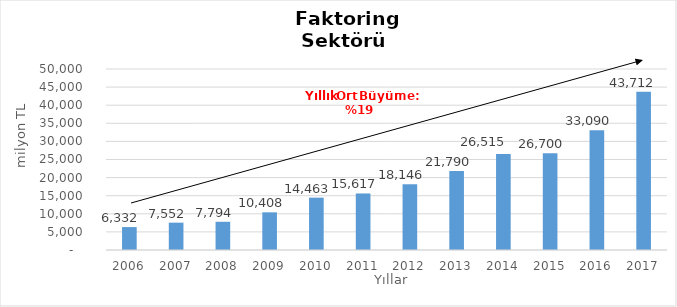
| Category | Faktoring  |
|---|---|
| 2006.0 | 6331.998 |
| 2007.0 | 7552.18 |
| 2008.0 | 7794.497 |
| 2009.0 | 10407.622 |
| 2010.0 | 14462.609 |
| 2011.0 | 15617.092 |
| 2012.0 | 18146.479 |
| 2013.0 | 21790.367 |
| 2014.0 | 26515 |
| 2015.0 | 26700 |
| 2016.0 | 33090 |
| 2017.0 | 43712 |